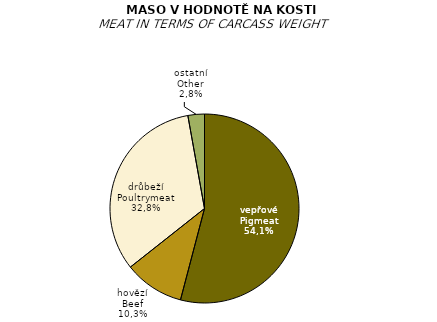
| Category | 2015 |
|---|---|
| vepřové | 42.9 |
| hovězí | 8.14 |
| drůbeží | 26.03 |
| ostatní | 2.24 |